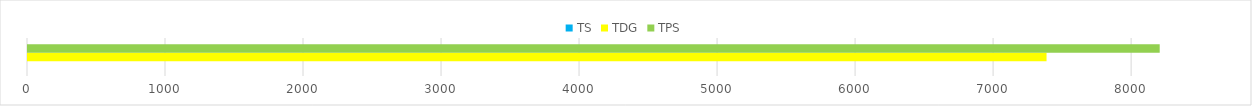
| Category | TS | TDG | TPS |
|---|---|---|---|
| 0 | 0 | 7380 | 8200 |